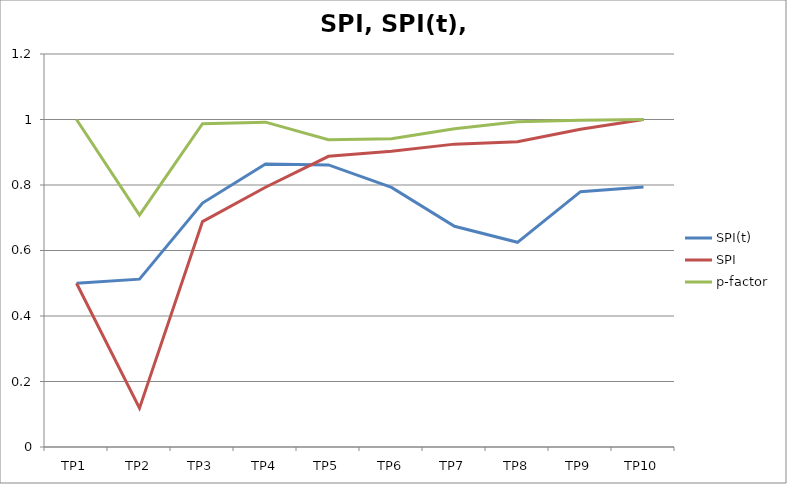
| Category | SPI(t) | SPI | p-factor |
|---|---|---|---|
| TP1 | 0.5 | 0.5 | 1 |
| TP2 | 0.512 | 0.118 | 0.708 |
| TP3 | 0.745 | 0.688 | 0.987 |
| TP4 | 0.864 | 0.793 | 0.992 |
| TP5 | 0.861 | 0.888 | 0.938 |
| TP6 | 0.793 | 0.903 | 0.941 |
| TP7 | 0.674 | 0.925 | 0.971 |
| TP8 | 0.625 | 0.932 | 0.993 |
| TP9 | 0.78 | 0.97 | 0.998 |
| TP10 | 0.794 | 1 | 1 |